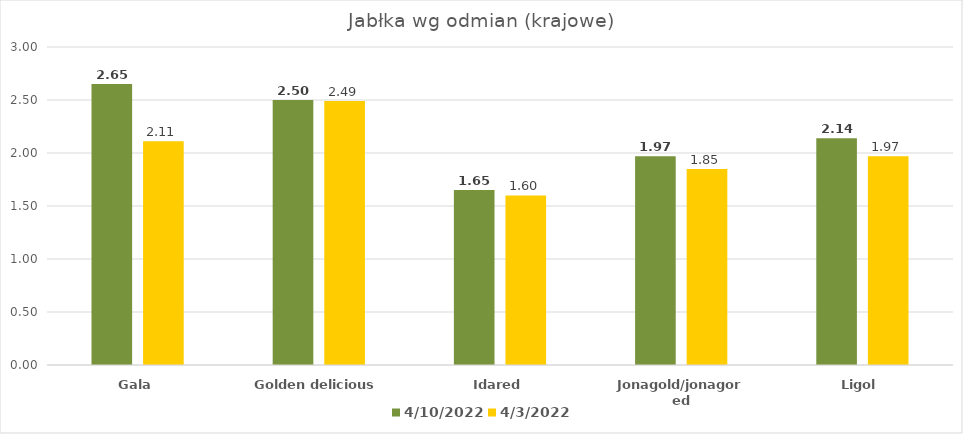
| Category | 10.04.2022 | 03.04.2022 |
|---|---|---|
| Gala | 2.65 | 2.11 |
| Golden delicious | 2.5 | 2.49 |
| Idared | 1.65 | 1.6 |
| Jonagold/jonagored | 1.97 | 1.85 |
| Ligol | 2.14 | 1.97 |